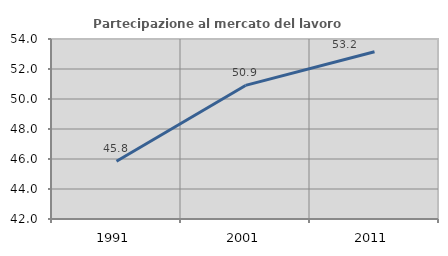
| Category | Partecipazione al mercato del lavoro  femminile |
|---|---|
| 1991.0 | 45.848 |
| 2001.0 | 50.905 |
| 2011.0 | 53.15 |